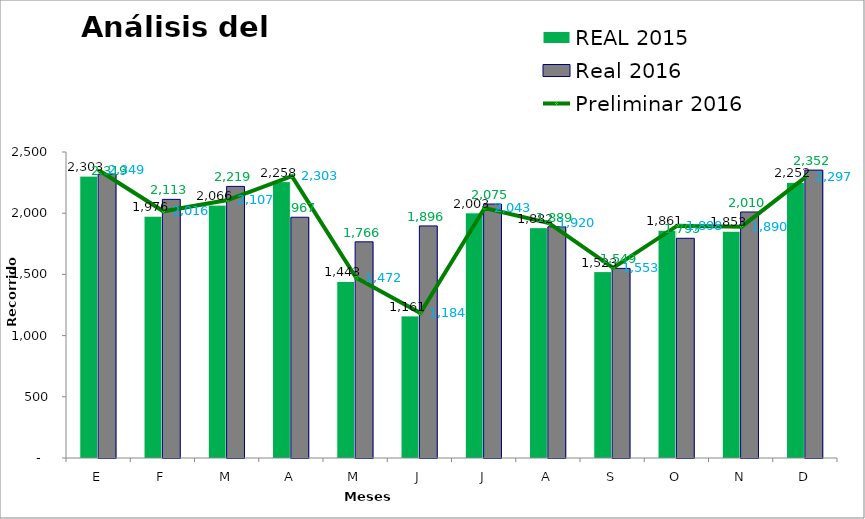
| Category | REAL 2015 | Real 2016 |
|---|---|---|
| E | 2303 | 2319 |
| F | 1976 | 2113 |
| M | 2066 | 2219 |
| A | 2258 | 1967 |
| M | 1443 | 1766 |
| J | 1161 | 1896 |
| J | 2003 | 2075 |
| A | 1882 | 1889 |
| S | 1523 | 1549 |
| O | 1861 | 1795 |
| N | 1853 | 2010 |
| D | 2252 | 2352 |